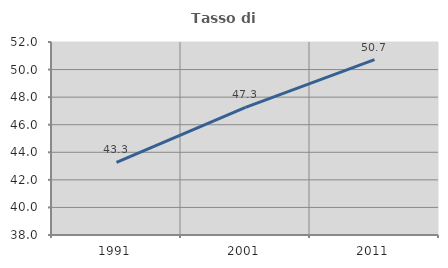
| Category | Tasso di occupazione   |
|---|---|
| 1991.0 | 43.272 |
| 2001.0 | 47.252 |
| 2011.0 | 50.723 |